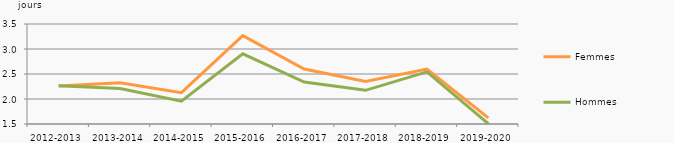
| Category | Femmes | Hommes |
|---|---|---|
| 2012-2013 | 2.26 | 2.265 |
| 2013-2014 | 2.323 | 2.208 |
| 2014-2015 | 2.126 | 1.957 |
| 2015-2016 | 3.267 | 2.904 |
| 2016-2017 | 2.599 | 2.338 |
| 2017-2018 | 2.35 | 2.173 |
| 2018-2019 | 2.6 | 2.543 |
| 2019-2020 | 1.622 | 1.505 |